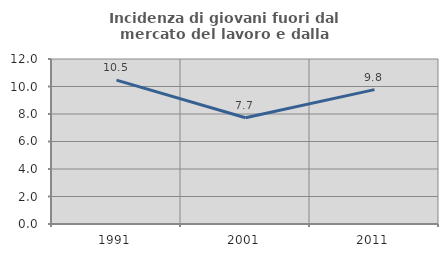
| Category | Incidenza di giovani fuori dal mercato del lavoro e dalla formazione  |
|---|---|
| 1991.0 | 10.464 |
| 2001.0 | 7.732 |
| 2011.0 | 9.774 |